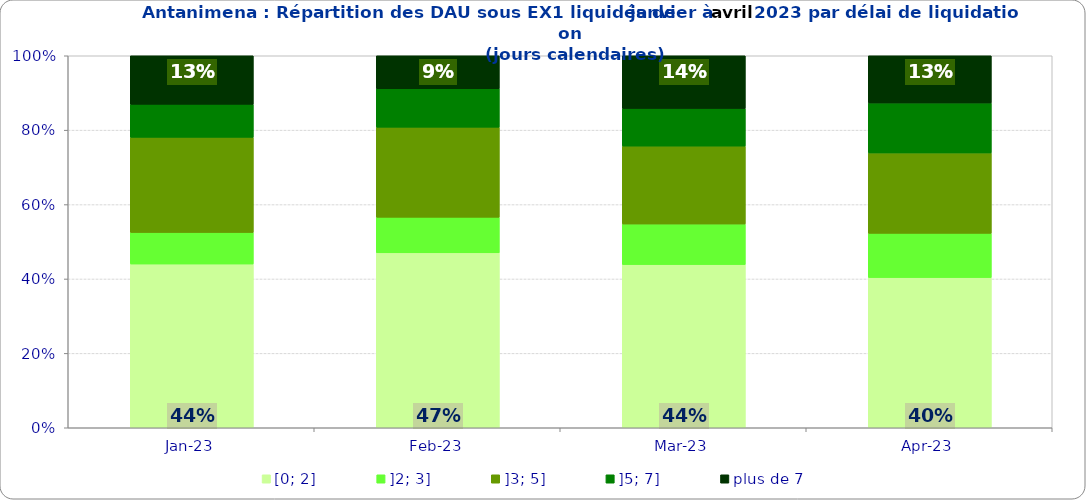
| Category | [0; 2] | ]2; 3] | ]3; 5] | ]5; 7] | plus de 7 |
|---|---|---|---|---|---|
| 2023-01-01 | 0.44 | 0.085 | 0.256 | 0.089 | 0.131 |
| 2023-02-01 | 0.47 | 0.096 | 0.242 | 0.103 | 0.089 |
| 2023-03-01 | 0.439 | 0.109 | 0.209 | 0.101 | 0.142 |
| 2023-04-01 | 0.404 | 0.119 | 0.216 | 0.134 | 0.127 |